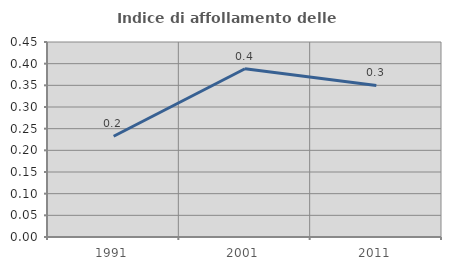
| Category | Indice di affollamento delle abitazioni  |
|---|---|
| 1991.0 | 0.233 |
| 2001.0 | 0.388 |
| 2011.0 | 0.35 |